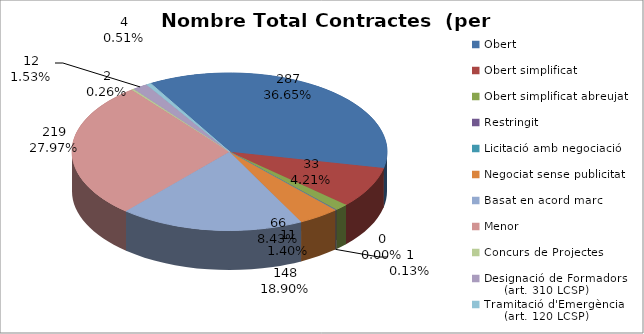
| Category | Nombre Total Contractes |
|---|---|
| Obert | 287 |
| Obert simplificat | 66 |
| Obert simplificat abreujat | 11 |
| Restringit | 1 |
| Licitació amb negociació | 0 |
| Negociat sense publicitat | 33 |
| Basat en acord marc | 148 |
| Menor | 219 |
| Concurs de Projectes | 2 |
| Designació de Formadors
     (art. 310 LCSP) | 12 |
| Tramitació d'Emergència
     (art. 120 LCSP) | 4 |